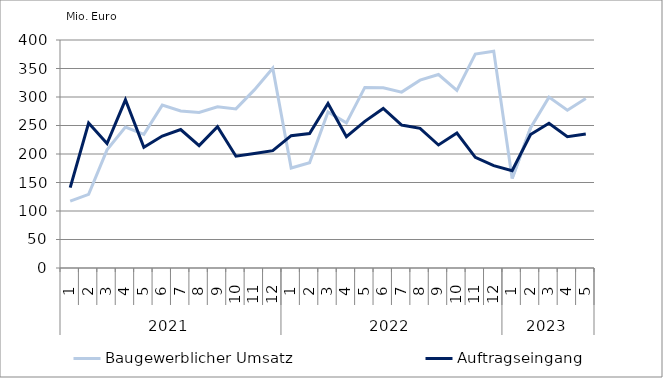
| Category | Baugewerblicher Umsatz | Auftragseingang |
|---|---|---|
| 0 | 117421.805 | 141020.655 |
| 1 | 129162.55 | 254416.876 |
| 2 | 207280.837 | 218451.405 |
| 3 | 247094.279 | 295077.868 |
| 4 | 234515.312 | 211696.129 |
| 5 | 285732.845 | 231455.155 |
| 6 | 275480.885 | 242932.505 |
| 7 | 272787.524 | 214636.944 |
| 8 | 282850.254 | 247827.991 |
| 9 | 279173.21 | 196069.238 |
| 10 | 312511.437 | 201015.897 |
| 11 | 350582.01 | 205949.991 |
| 12 | 175456.852 | 232178.255 |
| 13 | 184578.32 | 236006.862 |
| 14 | 273732.567 | 288451.109 |
| 15 | 254683.671 | 230228.968 |
| 16 | 316794.568 | 257235.39 |
| 17 | 316277.567 | 279900.179 |
| 18 | 308621.034 | 250827.343 |
| 19 | 329490.411 | 244949.341 |
| 20 | 339435.208 | 215809.075 |
| 21 | 311599.811 | 236674.056 |
| 22 | 375203.994 | 194107.214 |
| 23 | 380445.583 | 179631.624 |
| 24 | 156885.157 | 170764.939 |
| 25 | 245647.016 | 234064.391 |
| 26 | 299793.904 | 253873.168 |
| 27 | 276653.498 | 230304.701 |
| 28 | 297513.239 | 235047.978 |